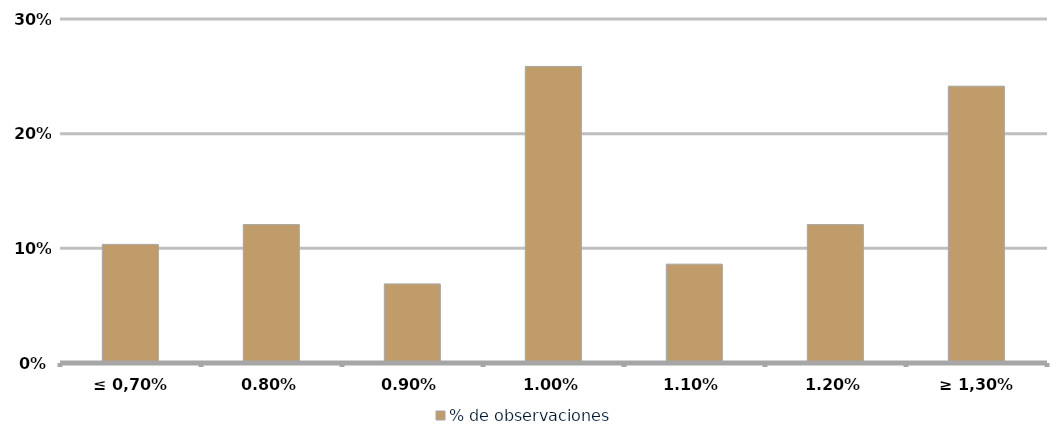
| Category | % de observaciones  |
|---|---|
| ≤ 0,70% | 0.103 |
| 0,80% | 0.121 |
| 0,90% | 0.069 |
| 1,00% | 0.259 |
| 1,10% | 0.086 |
| 1,20% | 0.121 |
| ≥ 1,30% | 0.241 |